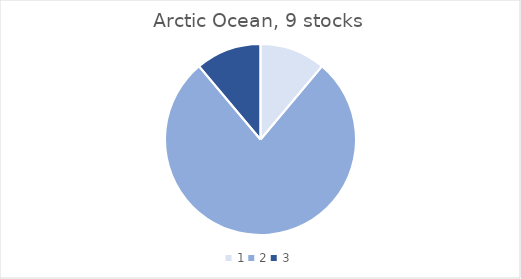
| Category | Arctic Ocean |
|---|---|
| 0 | 1 |
| 1 | 7 |
| 2 | 1 |